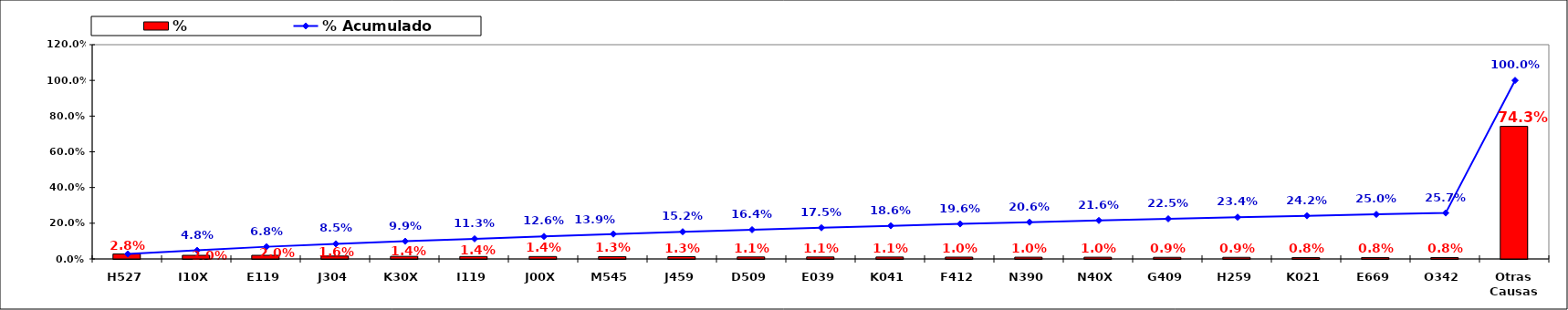
| Category | % |
|---|---|
| H527 | 0.028 |
| I10X | 0.02 |
| E119 | 0.02 |
| J304 | 0.016 |
| K30X | 0.014 |
| I119 | 0.014 |
| J00X | 0.014 |
| M545 | 0.013 |
| J459 | 0.013 |
| D509 | 0.011 |
| E039 | 0.011 |
| K041 | 0.011 |
| F412 | 0.01 |
| N390 | 0.01 |
| N40X | 0.01 |
| G409 | 0.009 |
| H259 | 0.009 |
| K021 | 0.008 |
| E669 | 0.008 |
| O342 | 0.008 |
| Otras Causas | 0.743 |